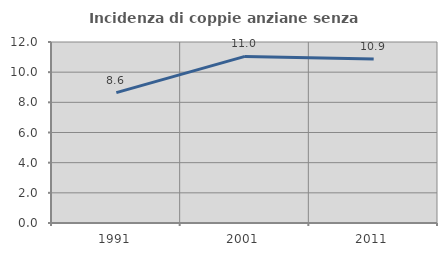
| Category | Incidenza di coppie anziane senza figli  |
|---|---|
| 1991.0 | 8.642 |
| 2001.0 | 11.046 |
| 2011.0 | 10.881 |